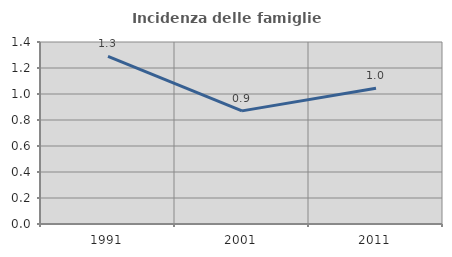
| Category | Incidenza delle famiglie numerose |
|---|---|
| 1991.0 | 1.289 |
| 2001.0 | 0.87 |
| 2011.0 | 1.044 |